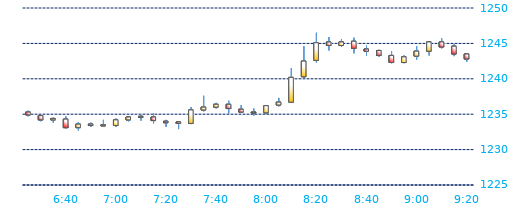
| Category | Series 0 | Series 1 | Series 2 | Series 3 |
|---|---|---|---|---|
| 2016-04-26 09:20:00 | 1243.5 | 1243.6 | 1242.4 | 1242.8 |
| 2016-04-26 09:15:00 | 1244.6 | 1244.9 | 1243.2 | 1243.5 |
| 2016-04-26 09:10:00 | 1245.2 | 1245.7 | 1244.3 | 1244.5 |
| 2016-04-26 09:05:00 | 1243.9 | 1245.2 | 1243.3 | 1245.2 |
| 2016-04-26 09:00:00 | 1243.2 | 1244.6 | 1242.7 | 1243.9 |
| 2016-04-26 08:55:00 | 1242.3 | 1243.3 | 1242.2 | 1243.1 |
| 2016-04-26 08:50:00 | 1243.3 | 1243.9 | 1242.2 | 1242.3 |
| 2016-04-26 08:45:00 | 1244 | 1244.1 | 1243.1 | 1243.3 |
| 2016-04-26 08:40:00 | 1244.2 | 1244.7 | 1243.3 | 1243.9 |
| 2016-04-26 08:35:00 | 1245.3 | 1245.8 | 1243.6 | 1244.3 |
| 2016-04-26 08:30:00 | 1244.7 | 1245.6 | 1244.5 | 1245.2 |
| 2016-04-26 08:25:00 | 1245.2 | 1245.9 | 1244 | 1244.7 |
| 2016-04-26 08:20:00 | 1242.6 | 1246.5 | 1242.3 | 1245.1 |
| 2016-04-26 08:15:00 | 1240.3 | 1244.6 | 1240.1 | 1242.5 |
| 2016-04-26 08:10:00 | 1236.7 | 1241.5 | 1236.6 | 1240.2 |
| 2016-04-26 08:05:00 | 1236.3 | 1237.3 | 1236.1 | 1236.7 |
| 2016-04-26 08:00:00 | 1235.2 | 1236.3 | 1235 | 1236.2 |
| 2016-04-26 07:55:00 | 1235.3 | 1235.8 | 1234.8 | 1235.3 |
| 2016-04-26 07:50:00 | 1235.7 | 1236.3 | 1235.2 | 1235.3 |
| 2016-04-26 07:45:00 | 1236.4 | 1236.9 | 1235.1 | 1235.8 |
| 2016-04-26 07:40:00 | 1236 | 1236.6 | 1235.8 | 1236.4 |
| 2016-04-26 07:35:00 | 1235.6 | 1237.6 | 1235.4 | 1236 |
| 2016-04-26 07:30:00 | 1233.7 | 1236 | 1233.6 | 1235.6 |
| 2016-04-26 07:25:00 | 1233.9 | 1233.9 | 1232.9 | 1233.7 |
| 2016-04-26 07:20:00 | 1234 | 1234.2 | 1233.2 | 1233.8 |
| 2016-04-26 07:15:00 | 1234.6 | 1235.1 | 1233.7 | 1234.1 |
| 2016-04-26 07:10:00 | 1234.6 | 1234.9 | 1234.1 | 1234.7 |
| 2016-04-26 07:05:00 | 1234.2 | 1234.7 | 1234 | 1234.6 |
| 2016-04-26 07:00:00 | 1233.4 | 1234.4 | 1233.2 | 1234.2 |
| 2016-04-26 06:55:00 | 1233.4 | 1234.2 | 1233.3 | 1233.5 |
| 2016-04-26 06:50:00 | 1233.6 | 1233.8 | 1233.2 | 1233.4 |
| 2016-04-26 06:45:00 | 1233.1 | 1233.9 | 1232.7 | 1233.6 |
| 2016-04-26 06:40:00 | 1234.3 | 1234.7 | 1233 | 1233.1 |
| 2016-04-26 06:35:00 | 1234.2 | 1234.5 | 1233.8 | 1234.4 |
| 2016-04-26 06:30:00 | 1234.8 | 1234.8 | 1234 | 1234.2 |
| 2016-04-26 06:25:00 | 1235.3 | 1235.5 | 1234.7 | 1234.9 |